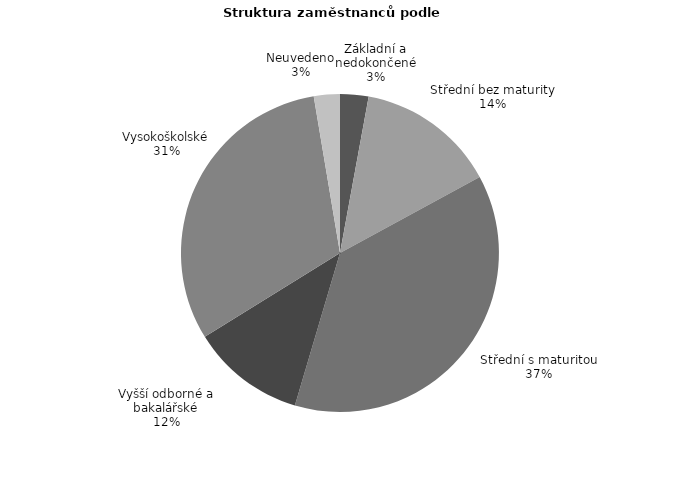
| Category | Series 0 |
|---|---|
| Základní a nedokončené | 18.718 |
| Střední bez maturity | 91.832 |
| Střední s maturitou | 242.949 |
| Vyšší odborné a bakalářské | 75.07 |
| Vysokoškolské | 201.961 |
| Neuvedeno | 17.135 |